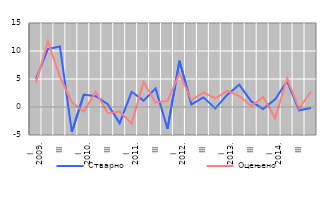
| Category | Стварно | Оцењено |
|---|---|---|
| I
2009. | 5.033 | 4.365 |
| II | 10.35 | 11.705 |
| III | 10.81 | 5.393 |
| IV | -4.438 | 0.851 |
| I
2010. | 2.218 | -0.825 |
| II | 1.94 | 2.736 |
| III | 0.493 | -1.112 |
| IV | -2.885 | -0.8 |
| I
2011. | 2.717 | -2.966 |
| II | 1.138 | 4.449 |
| III | 3.322 | 0.824 |
| IV | -3.901 | 1.092 |
| I
2012. | 8.26 | 6.003 |
| II | 0.454 | 1.235 |
| III | 1.718 | 2.592 |
| IV | -0.245 | 1.549 |
| I
2013. | 2.197 | 2.866 |
| II | 3.997 | 1.945 |
| III | 0.997 | 0.169 |
| IV | -0.339 | 1.776 |
| I
2014. | 1.387 | -2.029 |
| II | 4.625 | 5.13 |
| III | -0.585 | -0.28 |
| IV | -0.171 | 2.767 |